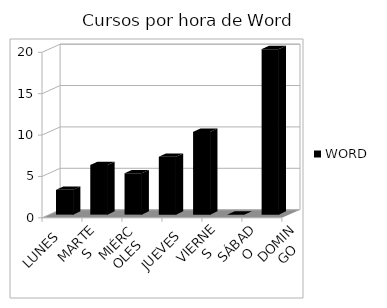
| Category | WORD |
|---|---|
| LUNES | 3 |
| MARTES | 6 |
| MIÉRCOLES | 5 |
| JUEVES | 7 |
| VIERNES | 10 |
| SÁBADO | 0 |
| DOMINGO | 20 |